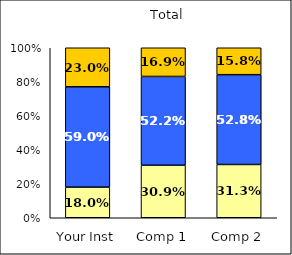
| Category | Low Civic Awareness | Average Civic Awareness | High Civic Awareness |
|---|---|---|---|
| Your Inst | 0.18 | 0.59 | 0.23 |
| Comp 1 | 0.309 | 0.522 | 0.169 |
| Comp 2 | 0.313 | 0.528 | 0.158 |